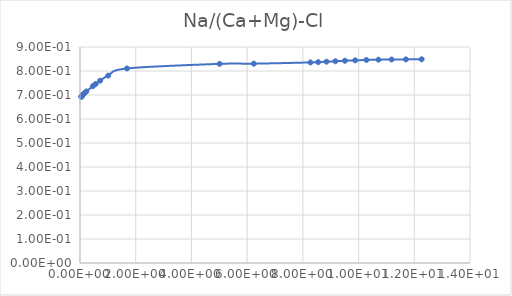
| Category | Series 0 |
|---|---|
| 0.045798 | 0.693 |
| 0.050886 | 0.694 |
| 0.057258 | 0.695 |
| 0.065456 | 0.696 |
| 0.076369 | 0.698 |
| 0.091683 | 0.7 |
| 0.11463 | 0.703 |
| 0.15298 | 0.707 |
| 0.2297 | 0.715 |
| 0.46159 | 0.737 |
| 0.56399 | 0.746 |
| 0.72477 | 0.76 |
| 1.0138 | 0.781 |
| 1.6863 | 0.811 |
| 5.0106 | 0.83 |
| 6.241 | 0.83 |
| 8.2722 | 0.836 |
| 8.5505 | 0.837 |
| 8.8482 | 0.839 |
| 9.1674 | 0.841 |
| 9.5104 | 0.843 |
| 9.8801 | 0.844 |
| 10.28 | 0.846 |
| 10.713 | 0.847 |
| 11.185 | 0.848 |
| 11.699 | 0.848 |
| 12.264 | 0.849 |